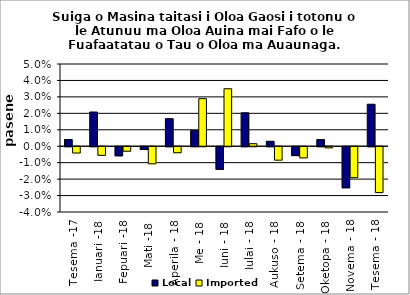
| Category | Local | Imported |
|---|---|---|
| Tesema -17 | 0.004 | -0.004 |
| Ianuari -18 | 0.021 | -0.005 |
| Fepuari -18 | -0.006 | -0.003 |
| Mati -18 | -0.002 | -0.01 |
| Aperila - 18 | 0.017 | -0.004 |
| Me - 18 | 0.01 | 0.029 |
| Iuni - 18 | -0.014 | 0.035 |
| Iulai - 18 | 0.02 | 0.002 |
| Aukuso - 18 | 0.003 | -0.008 |
| Setema - 18 | -0.005 | -0.007 |
| Oketopa - 18 | 0.004 | -0.001 |
| Novema - 18 | -0.025 | -0.019 |
| Tesema - 18 | 0.026 | -0.028 |